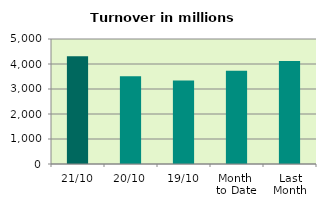
| Category | Series 0 |
|---|---|
| 21/10 | 4308.77 |
| 20/10 | 3514.625 |
| 19/10 | 3335.652 |
| Month 
to Date | 3731.274 |
| Last
Month | 4119.728 |